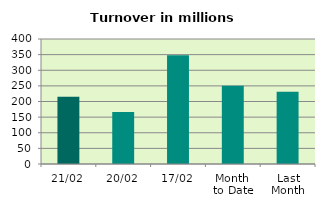
| Category | Series 0 |
|---|---|
| 21/02 | 215.364 |
| 20/02 | 166.484 |
| 17/02 | 347.61 |
| Month 
to Date | 250.703 |
| Last
Month | 231.348 |